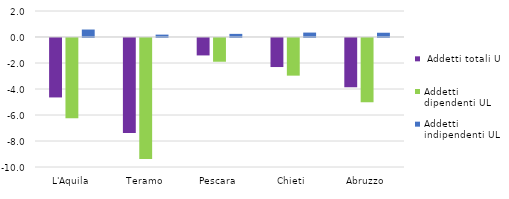
| Category |  Addetti totali UL | Addetti dipendenti UL | Addetti indipendenti UL |
|---|---|---|---|
| L'Aquila | -4.572 | -6.176 | 0.575 |
| Teramo | -7.311 | -9.305 | 0.183 |
| Pescara | -1.34 | -1.827 | 0.241 |
| Chieti | -2.234 | -2.896 | 0.34 |
| Abruzzo | -3.788 | -4.946 | 0.328 |